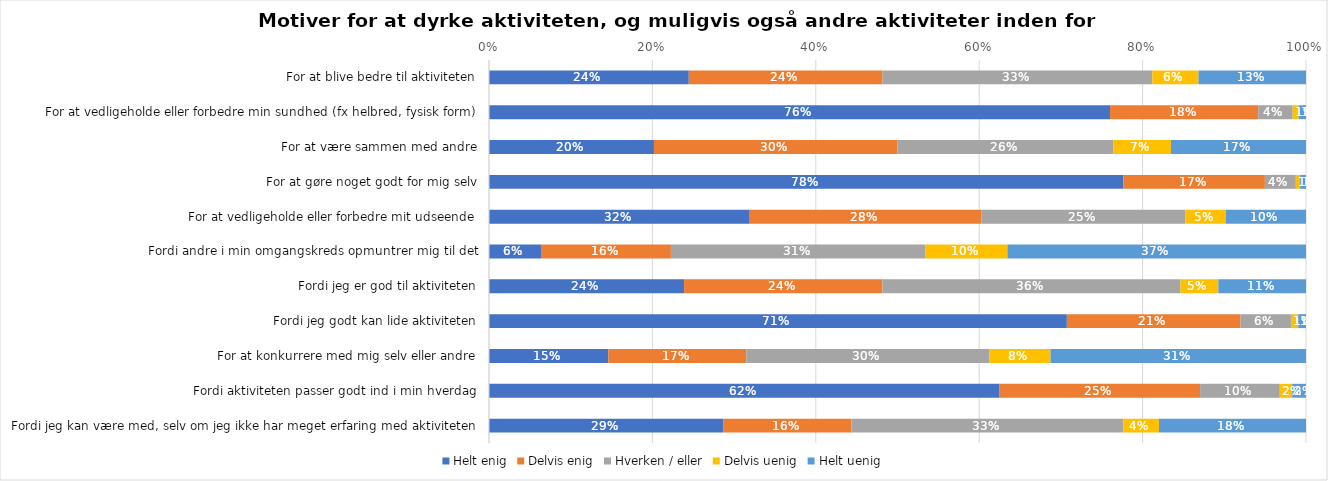
| Category | Helt enig | Delvis enig | Hverken / eller | Delvis uenig | Helt uenig |
|---|---|---|---|---|---|
| For at blive bedre til aktiviteten | 0.245 | 0.237 | 0.33 | 0.057 | 0.132 |
| For at vedligeholde eller forbedre min sundhed (fx helbred, fysisk form) | 0.76 | 0.181 | 0.042 | 0.007 | 0.009 |
| For at være sammen med andre | 0.202 | 0.298 | 0.264 | 0.07 | 0.165 |
| For at gøre noget godt for mig selv | 0.777 | 0.173 | 0.038 | 0.005 | 0.007 |
| For at vedligeholde eller forbedre mit udseende | 0.319 | 0.283 | 0.25 | 0.05 | 0.098 |
| Fordi andre i min omgangskreds opmuntrer mig til det | 0.065 | 0.158 | 0.311 | 0.101 | 0.365 |
| Fordi jeg er god til aktiviteten | 0.239 | 0.243 | 0.365 | 0.046 | 0.107 |
| Fordi jeg godt kan lide aktiviteten | 0.707 | 0.213 | 0.062 | 0.009 | 0.01 |
| For at konkurrere med mig selv eller andre | 0.146 | 0.169 | 0.297 | 0.075 | 0.313 |
| Fordi aktiviteten passer godt ind i min hverdag | 0.625 | 0.245 | 0.098 | 0.015 | 0.017 |
| Fordi jeg kan være med, selv om jeg ikke har meget erfaring med aktiviteten | 0.287 | 0.157 | 0.333 | 0.044 | 0.18 |